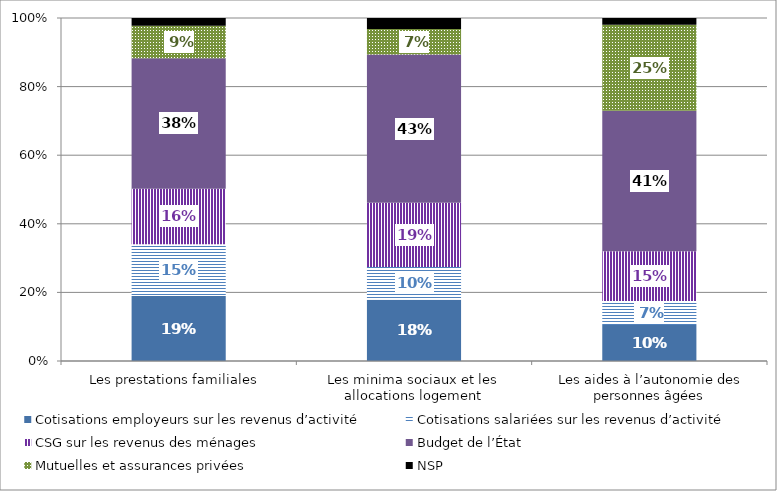
| Category | Cotisations employeurs sur les revenus d’activité | Cotisations salariées sur les revenus d’activité | CSG sur les revenus des ménages | Budget de l’État | Mutuelles et assurances privées | NSP |
|---|---|---|---|---|---|---|
| Les prestations familiales  | 0.189 | 0.151 | 0.162 | 0.381 | 0.095 | 0.022 |
| Les minima sociaux et les allocations logement | 0.179 | 0.095 | 0.188 | 0.432 | 0.074 | 0.032 |
|  Les aides à l’autonomie des personnes âgées | 0.105 | 0.07 | 0.145 | 0.409 | 0.251 | 0.019 |